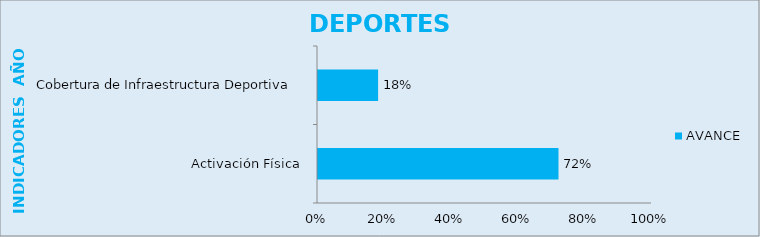
| Category | AVANCE |
|---|---|
| Activación Física | 0.72 |
| Cobertura de Infraestructura Deportiva  | 0.18 |